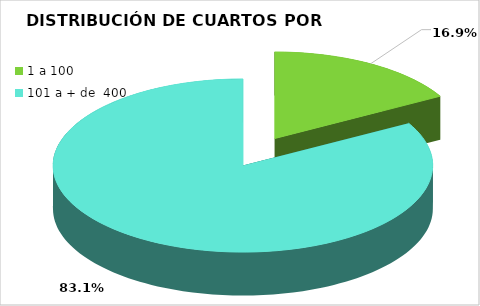
| Category | Series 0 |
|---|---|
| 1 a 100 | 0.169 |
| 101 a + de  400 | 0.831 |